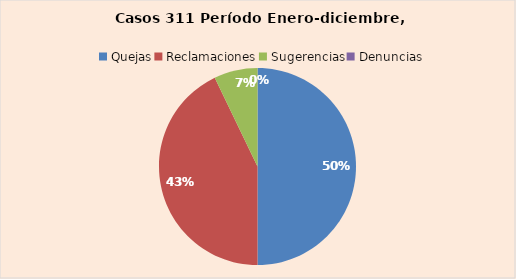
| Category | Series 0 |
|---|---|
| Quejas | 7 |
| Reclamaciones | 6 |
| Sugerencias | 1 |
| Denuncias | 0 |